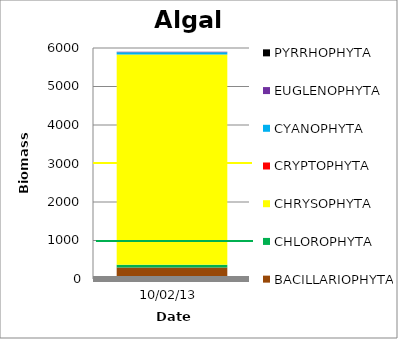
| Category | BACILLARIOPHYTA | CHLOROPHYTA | CHRYSOPHYTA | CRYPTOPHYTA | CYANOPHYTA | EUGLENOPHYTA | PYRRHOPHYTA |
|---|---|---|---|---|---|---|---|
| 2013-10-02 | 299 | 72.8 | 5460 | 0 | 54.6 | 13 | 0 |